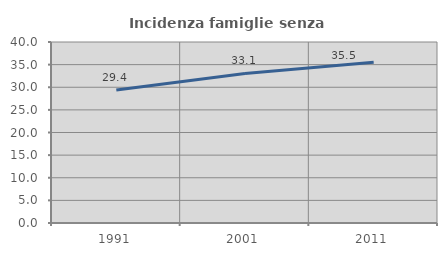
| Category | Incidenza famiglie senza nuclei |
|---|---|
| 1991.0 | 29.388 |
| 2001.0 | 33.056 |
| 2011.0 | 35.524 |